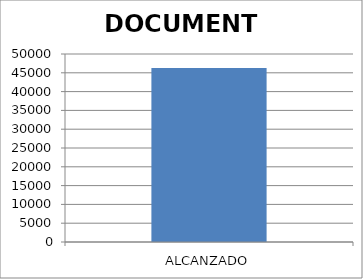
| Category | DOCUMENTO |
|---|---|
| ALCANZADO | 46267 |